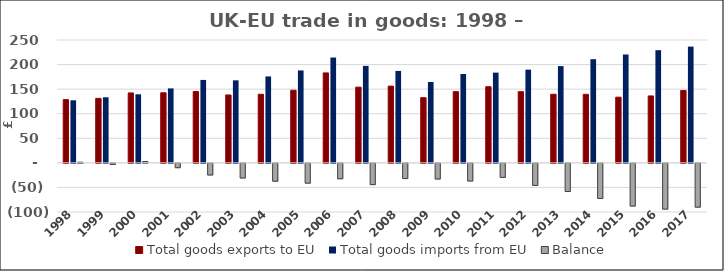
| Category | Total goods exports to EU | Total goods imports from EU |  Balance  |
|---|---|---|---|
| 1998 | 128.677 | 127.306 | 1.371 |
| 1999 | 131.221 | 133.443 | -2.223 |
| 2000 | 142.288 | 139.504 | 2.783 |
| 2001 | 142.605 | 151.467 | -8.863 |
| 2002 | 145.09 | 168.728 | -23.638 |
| 2003 | 138.147 | 167.949 | -29.802 |
| 2004 | 139.533 | 175.894 | -36.361 |
| 2005 | 147.782 | 188.07 | -40.288 |
| 2006 | 183.039 | 214.336 | -31.297 |
| 2007 | 154.058 | 197.327 | -43.269 |
| 2008 | 156.145 | 187.096 | -30.951 |
| 2009 | 132.697 | 164.57 | -31.873 |
| 2010 | 144.943 | 180.848 | -35.905 |
| 2011 | 154.979 | 183.59 | -28.611 |
| 2012 | 144.825 | 189.662 | -44.837 |
| 2013 | 139.633 | 196.898 | -57.265 |
| 2014 | 139.48 | 210.915 | -71.436 |
| 2015 | 133.664 | 220.522 | -86.858 |
| 2016 | 136.169 | 229.272 | -93.103 |
| 2017 | 147.422 | 236.569 | -89.147 |